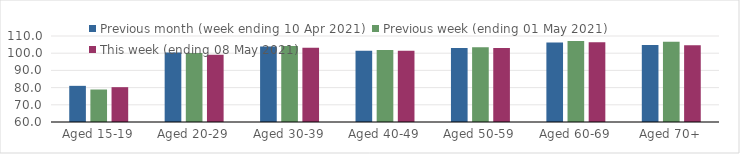
| Category | Previous month (week ending 10 Apr 2021) | Previous week (ending 01 May 2021) | This week (ending 08 May 2021) |
|---|---|---|---|
| Aged 15-19 | 81.02 | 78.89 | 80.25 |
| Aged 20-29 | 100.47 | 100.08 | 99.1 |
| Aged 30-39 | 103.95 | 104.25 | 103.19 |
| Aged 40-49 | 101.48 | 101.83 | 101.39 |
| Aged 50-59 | 103.06 | 103.45 | 102.98 |
| Aged 60-69 | 106.21 | 107.09 | 106.38 |
| Aged 70+ | 104.74 | 106.69 | 104.68 |